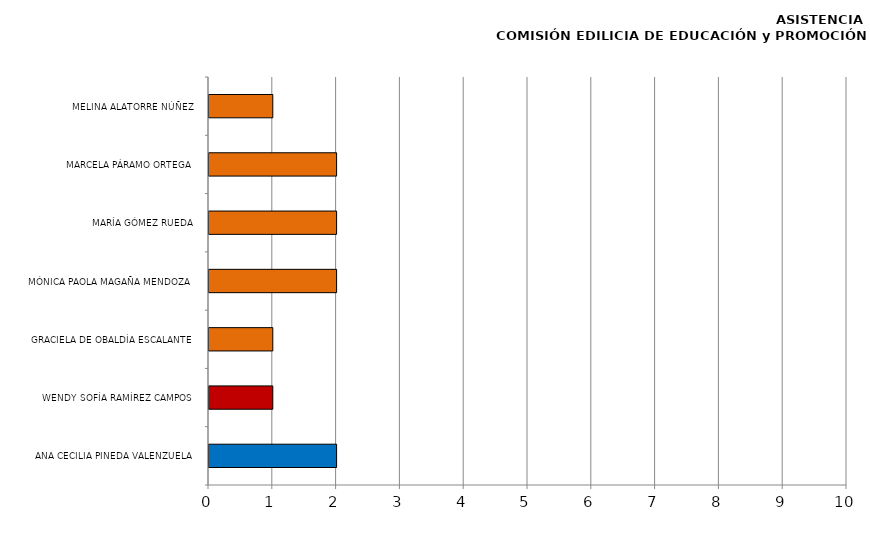
| Category | Series 0 |
|---|---|
| ANA CECILIA PINEDA VALENZUELA | 2 |
| WENDY SOFÍA RAMÍREZ CAMPOS | 1 |
| GRACIELA DE OBALDÍA ESCALANTE | 1 |
| MÓNICA PAOLA MAGAÑA MENDOZA | 2 |
| MARÍA GÓMEZ RUEDA | 2 |
| MARCELA PÁRAMO ORTEGA | 2 |
| MELINA ALATORRE NÚÑEZ | 1 |